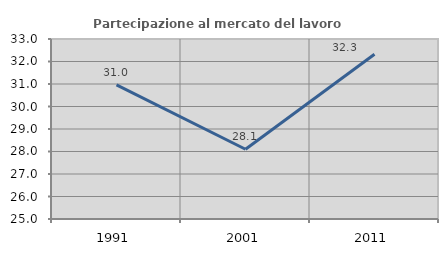
| Category | Partecipazione al mercato del lavoro  femminile |
|---|---|
| 1991.0 | 30.965 |
| 2001.0 | 28.099 |
| 2011.0 | 32.319 |